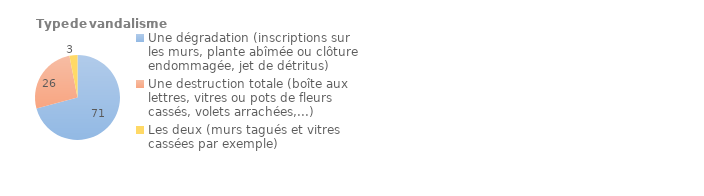
| Category | Series 0 |
|---|---|
| Une dégradation (inscriptions sur les murs, plante abîmée ou clôture endommagée, jet de détritus) | 70.802 |
| Une destruction totale (boîte aux lettres, vitres ou pots de fleurs cassés, volets arrachées,...) | 26.15 |
| Les deux (murs tagués et vitres cassées par exemple) | 3.048 |